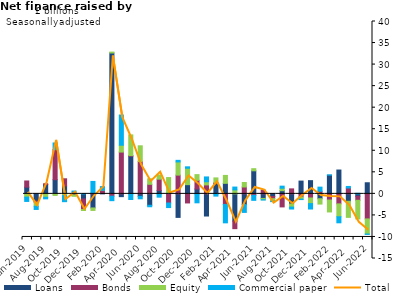
| Category | Loans | Bonds | Equity | Commercial paper |
|---|---|---|---|---|
| Jun-2019 | 1.552 | 1.437 | -0.756 | -1.001 |
| Jul-2019 | -1.681 | -0.281 | -0.912 | -0.742 |
| Aug-2019 | 2.173 | 0.174 | -0.801 | -0.357 |
| Sep-2019 | 3.281 | 6.981 | -0.368 | 1.548 |
| Oct-2019 | 1.846 | 1.651 | -0.397 | -1.416 |
| Nov-2019 | -0.082 | -0.195 | -0.294 | 0.654 |
| Dec-2019 | -1.191 | -2.415 | -0.257 | 0.031 |
| Jan-2020 | -3.269 | 0.155 | -0.574 | 2.731 |
| Feb-2020 | 0.087 | 0.764 | 0.01 | 0.826 |
| Mar-2020 | 32.689 | -0.54 | 0.214 | -1.041 |
| Apr-2020 | -0.646 | 9.698 | 1.589 | 7.014 |
| May-2020 | 8.748 | 0.131 | 4.809 | -1.303 |
| Jun-2020 | -0.585 | 7.494 | 3.658 | -0.564 |
| Jul-2020 | -2.65 | 2.212 | 1.273 | -0.34 |
| Aug-2020 | 0.795 | 2.614 | 0.977 | -0.762 |
| Sep-2020 | 0.174 | -2.122 | 3.606 | -1.058 |
| Oct-2020 | -5.459 | 4.349 | 3.063 | 0.366 |
| Nov-2020 | 2.135 | -2.106 | 3.813 | 0.327 |
| Dec-2020 | 1.13 | 2.015 | 1.316 | -2.076 |
| Jan-2021 | -5.14 | 2.081 | 0.735 | 1.11 |
| Feb-2021 | 2.398 | 0.193 | 1.112 | -0.517 |
| Mar-2021 | 2.442 | -2.452 | 1.842 | -4.272 |
| Apr-2021 | -6.322 | -1.754 | 0.927 | 0.65 |
| May-2021 | -2.483 | 1.596 | 1.037 | -1.817 |
| Jun-2021 | 5.352 | -0.338 | 0.49 | -1.166 |
| Jul-2021 | -1.057 | 0.867 | -0.3 | -0.072 |
| Aug-2021 | -0.618 | -0.499 | -0.55 | -0.136 |
| Sep-2021 | 0.734 | -3.026 | 0.575 | 0.481 |
| Oct-2021 | -2.358 | 1.158 | -0.712 | -0.446 |
| Nov-2021 | 2.966 | -0.729 | -0.49 | -0.107 |
| Dec-2021 | 3.067 | -0.957 | -1.304 | -1.25 |
| Jan-2022 | -1.125 | 0.598 | -1.245 | 0.961 |
| Feb-2022 | 4.335 | -1.431 | -2.766 | 0.058 |
| Mar-2022 | 5.531 | -2.323 | -2.989 | -1.403 |
| Apr-2022 | -1.721 | 1.362 | -3.732 | 0.359 |
| May-2022 | -0.552 | -0.942 | -4.325 | 0.142 |
| Jun-2022 | 2.578 | -5.816 | -3.504 | -0.081 |